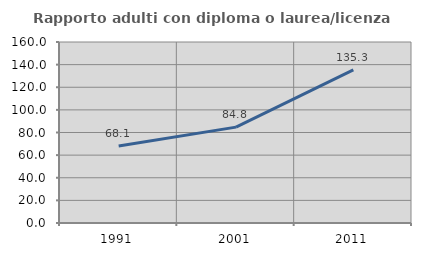
| Category | Rapporto adulti con diploma o laurea/licenza media  |
|---|---|
| 1991.0 | 68.114 |
| 2001.0 | 84.753 |
| 2011.0 | 135.34 |